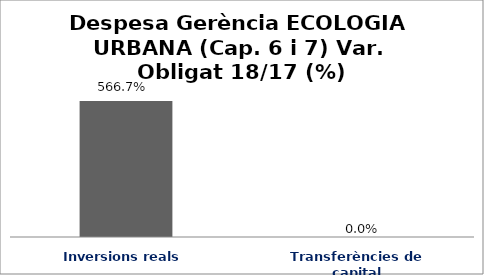
| Category | Series 0 |
|---|---|
| Inversions reals | 5.667 |
| Transferències de capital | 0 |